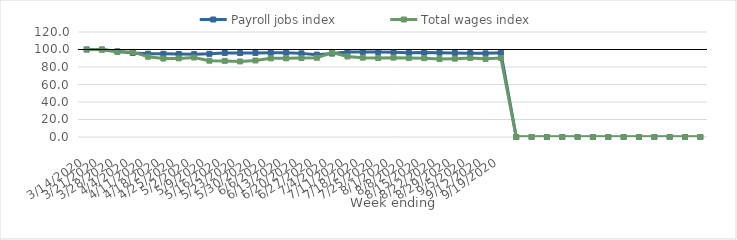
| Category | Payroll jobs index | Total wages index |
|---|---|---|
| 14/03/2020 | 100 | 100 |
| 21/03/2020 | 99.973 | 99.821 |
| 28/03/2020 | 97.938 | 97.23 |
| 04/04/2020 | 96.093 | 97.265 |
| 11/04/2020 | 95.178 | 91.761 |
| 18/04/2020 | 95.082 | 89.626 |
| 25/04/2020 | 94.856 | 89.841 |
| 02/05/2020 | 94.695 | 90.861 |
| 09/05/2020 | 95.084 | 87.157 |
| 16/05/2020 | 96.042 | 86.985 |
| 23/05/2020 | 95.928 | 86.334 |
| 30/05/2020 | 96.06 | 87.441 |
| 06/06/2020 | 96.271 | 89.863 |
| 13/06/2020 | 96.402 | 89.868 |
| 20/06/2020 | 95.574 | 90.312 |
| 27/06/2020 | 94.14 | 90.561 |
| 04/07/2020 | 95.33 | 96.475 |
| 11/07/2020 | 97.125 | 92.013 |
| 18/07/2020 | 97.102 | 90.692 |
| 25/07/2020 | 97.098 | 90.29 |
| 01/08/2020 | 96.767 | 90.698 |
| 08/08/2020 | 96.195 | 90.233 |
| 15/08/2020 | 96.47 | 90.1 |
| 22/08/2020 | 96.313 | 89.01 |
| 29/08/2020 | 96.065 | 89.565 |
| 05/09/2020 | 95.818 | 90.424 |
| 12/09/2020 | 95.62 | 89.323 |
| 19/09/2020 | 96.321 | 90.312 |